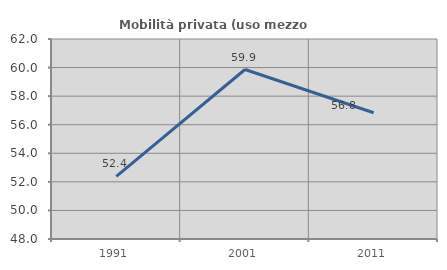
| Category | Mobilità privata (uso mezzo privato) |
|---|---|
| 1991.0 | 52.381 |
| 2001.0 | 59.863 |
| 2011.0 | 56.839 |